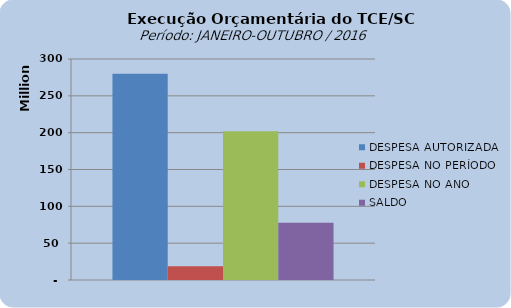
| Category | DESPESA AUTORIZADA | DESPESA NO PERÍODO | DESPESA NO ANO | SALDO |
|---|---|---|---|---|
| 0 | 279823843.27 | 18502088.85 | 202086451.88 | 77737391.39 |